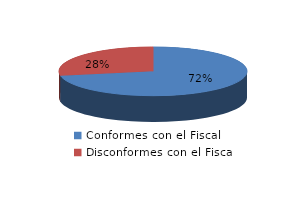
| Category | Series 0 |
|---|---|
| 0 | 44 |
| 1 | 17 |